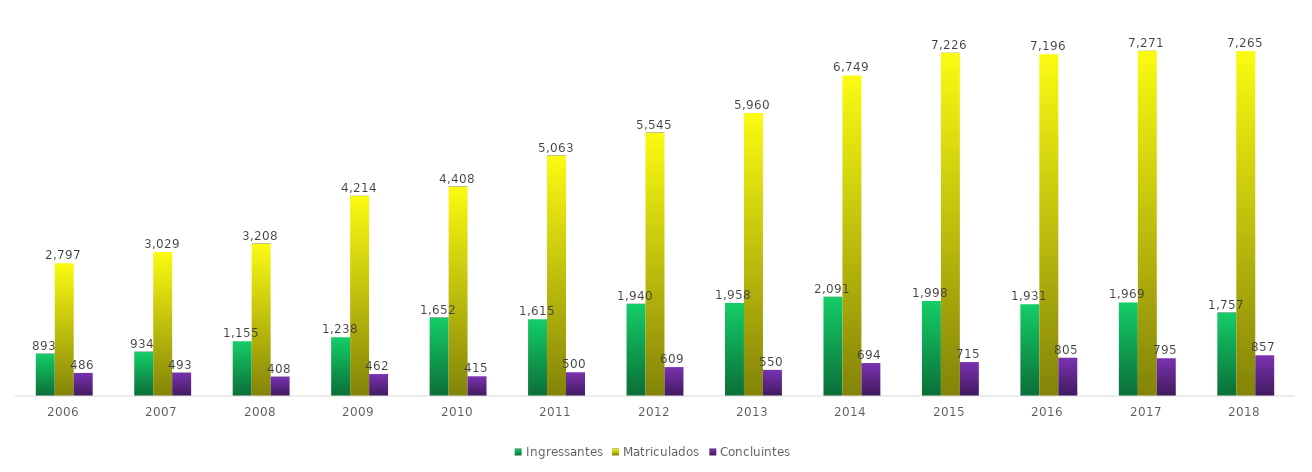
| Category | Ingressantes | Matriculados | Concluintes |
|---|---|---|---|
| 2006.0 | 893 | 2797 | 486 |
| 2007.0 | 934 | 3029 | 493 |
| 2008.0 | 1155 | 3208 | 408 |
| 2009.0 | 1238 | 4214 | 462 |
| 2010.0 | 1652 | 4408 | 415 |
| 2011.0 | 1615 | 5063 | 500 |
| 2012.0 | 1940 | 5545 | 609 |
| 2013.0 | 1958 | 5960 | 550 |
| 2014.0 | 2091 | 6749 | 694 |
| 2015.0 | 1998 | 7226 | 715 |
| 2016.0 | 1931 | 7196 | 805 |
| 2017.0 | 1969 | 7271 | 795 |
| 2018.0 | 1757 | 7265 | 857 |